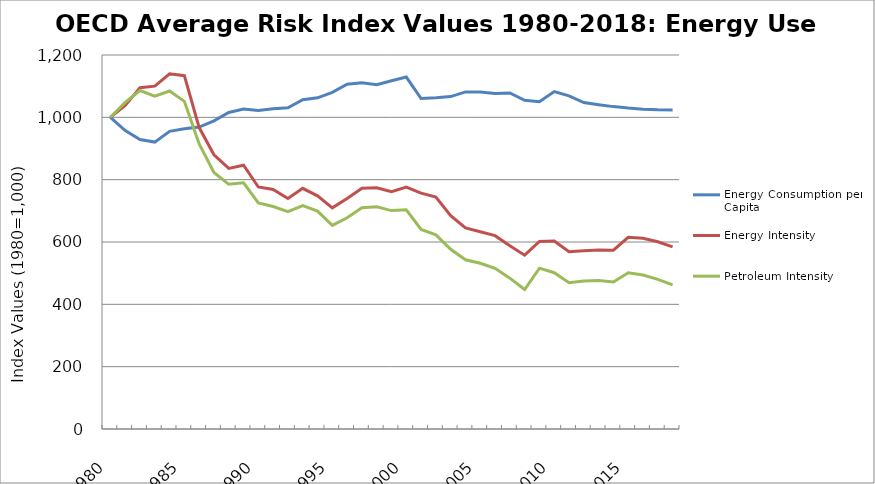
| Category | Energy Consumption per Capita | Energy Intensity | Petroleum Intensity |
|---|---|---|---|
| 1980.0 | 1000 | 1000 | 1000 |
| 1981.0 | 957.422 | 1038.341 | 1047.893 |
| 1982.0 | 928.792 | 1094.89 | 1086.088 |
| 1983.0 | 920.569 | 1100.148 | 1067.861 |
| 1984.0 | 955.189 | 1139.468 | 1084.361 |
| 1985.0 | 963.17 | 1133.584 | 1051.318 |
| 1986.0 | 968.71 | 967.107 | 914.466 |
| 1987.0 | 988.705 | 879.702 | 823.181 |
| 1988.0 | 1015.601 | 835.97 | 785.136 |
| 1989.0 | 1026.965 | 846.248 | 790.025 |
| 1990.0 | 1022.022 | 776.508 | 725.129 |
| 1991.0 | 1027.746 | 768.408 | 713.884 |
| 1992.0 | 1030.403 | 739.384 | 697.468 |
| 1993.0 | 1056.77 | 772.252 | 717.087 |
| 1994.0 | 1062.718 | 748.185 | 699.06 |
| 1995.0 | 1079.962 | 709.565 | 653.297 |
| 1996.0 | 1106.318 | 739.481 | 677.786 |
| 1997.0 | 1110.551 | 772.454 | 709.609 |
| 1998.0 | 1104.763 | 774.289 | 713.136 |
| 1999.0 | 1117.406 | 761.585 | 700.748 |
| 2000.0 | 1129.249 | 775.986 | 703.165 |
| 2001.0 | 1060.329 | 756.984 | 640.171 |
| 2002.0 | 1062.736 | 743.942 | 622.986 |
| 2003.0 | 1066.482 | 684.157 | 576.637 |
| 2004.0 | 1081.63 | 644.964 | 542.948 |
| 2005.0 | 1080.952 | 633.143 | 531.651 |
| 2006.0 | 1076.388 | 620.419 | 515.484 |
| 2007.0 | 1078.421 | 588.039 | 484.015 |
| 2008.0 | 1054.559 | 557.77 | 447.492 |
| 2009.0 | 1050.208 | 601.894 | 516.035 |
| 2010.0 | 1082.48 | 602.989 | 501.405 |
| 2011.0 | 1068.661 | 568.489 | 469.392 |
| 2012.0 | 1047.534 | 572.26 | 475.009 |
| 2013.0 | 1040.466 | 574.573 | 476.584 |
| 2014.0 | 1034.393 | 573.789 | 471.956 |
| 2015.0 | 1029.642 | 615.001 | 501.335 |
| 2016.0 | 1025.986 | 611.769 | 493.967 |
| 2017.0 | 1024.103 | 600.682 | 480.154 |
| 2018.0 | 1023.45 | 584.368 | 462.197 |